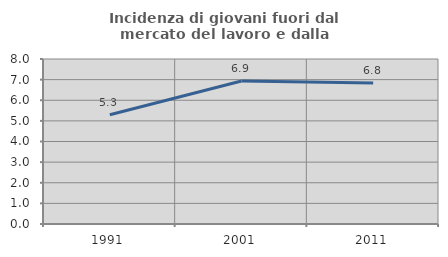
| Category | Incidenza di giovani fuori dal mercato del lavoro e dalla formazione  |
|---|---|
| 1991.0 | 5.298 |
| 2001.0 | 6.935 |
| 2011.0 | 6.837 |